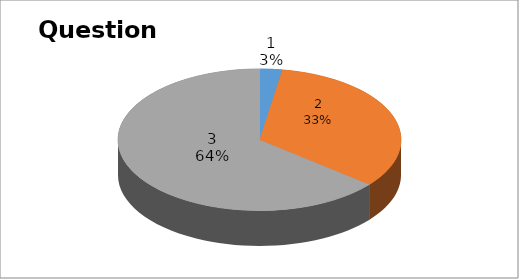
| Category | Series 0 |
|---|---|
| 0 | 1 |
| 1 | 13 |
| 2 | 25 |